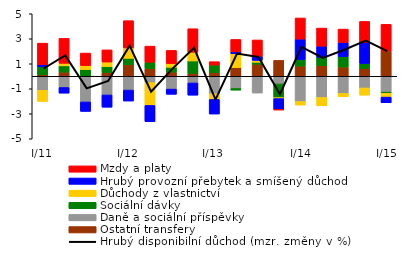
| Category | Ostatní transfery | Daně a sociální příspěvky | Sociální dávky  | Důchody z vlastnictví | Hrubý provozní přebytek a smíšený důchod | Mzdy a platy |
|---|---|---|---|---|---|---|
| I/11 | 0.12 | -1.127 | 0.636 | -0.884 | 0.18 | 1.716 |
| II | 0.333 | -0.898 | 0.5 | 0.207 | -0.451 | 1.991 |
| III | 0.028 | -2.052 | 0.509 | 0.319 | -0.758 | 1.002 |
| IV | 0.299 | -1.493 | 0.476 | 0.367 | -0.981 | 0.972 |
| I/12 | 0.917 | -1.102 | 0.519 | 0.831 | -0.878 | 2.18 |
| II | 0.612 | -0.51 | 0.51 | -1.821 | -1.297 | 1.291 |
| III | 0.335 | -1.025 | 0.386 | 0.3 | -0.415 | 1.049 |
| IV | 0.233 | -0.534 | 0.994 | 0.698 | -0.977 | 1.879 |
| I/13 | 0.279 | -1.401 | 0.618 | -0.454 | -1.165 | 0.271 |
| II | 0.7 | -0.979 | -0.129 | 1.101 | 0.152 | 0.994 |
| III | 0.967 | -1.339 | 0.154 | 0.152 | 0.335 | 1.298 |
|  IV | 1.272 | -0.614 | -1.095 | -0.075 | -0.882 | -0.023 |
|  I/14 | 0.813 | -2.023 | 0.529 | -0.279 | 1.637 | 1.685 |
| II | 0.853 | -1.693 | 0.659 | -0.671 | 0.896 | 1.45 |
| III | 0.739 | -1.371 | 0.839 | -0.266 | 1.128 | 1.07 |
| IV | 0.626 | -0.934 | 0.401 | -0.574 | 1.695 | 1.666 |
|  I/15 | 2.022 | -1.27 | -0.09 | -0.305 | -0.453 | 2.133 |